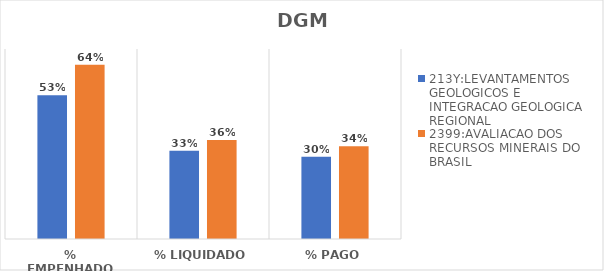
| Category | 213Y:LEVANTAMENTOS GEOLOGICOS E INTEGRACAO GEOLOGICA REGIONAL | 2399:AVALIACAO DOS RECURSOS MINERAIS DO BRASIL |
|---|---|---|
| % EMPENHADO | 0.53 | 0.642 |
| % LIQUIDADO | 0.325 | 0.365 |
| % PAGO | 0.303 | 0.342 |